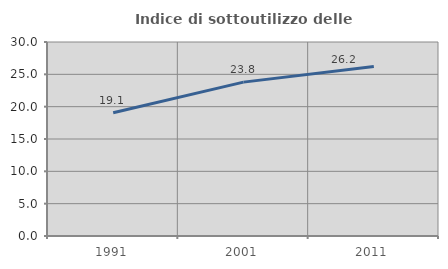
| Category | Indice di sottoutilizzo delle abitazioni  |
|---|---|
| 1991.0 | 19.067 |
| 2001.0 | 23.794 |
| 2011.0 | 26.201 |